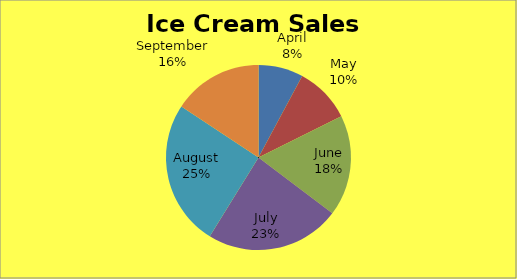
| Category | Chocolate | Vanilla | Strawberry | Neopolotan | Butterscotch |
|---|---|---|---|---|---|
| April | 400 | 200 | 300 | 400 | 100 |
| May | 500 | 200 | 200 | 400 | 300 |
| June | 900 | 500 | 700 | 800 | 600 |
| July | 1200 | 800 | 800 | 900 | 700 |
| August | 1300 | 800 | 900 | 1000 | 600 |
| September | 800 | 400 | 500 | 500 | 400 |